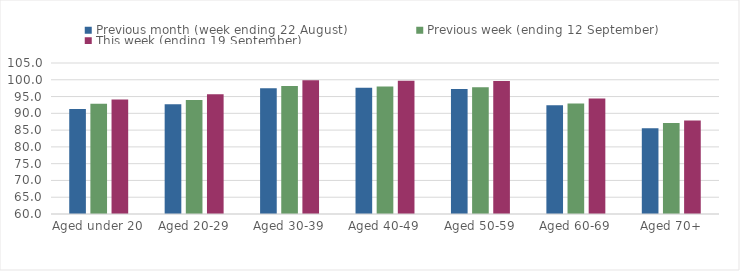
| Category | Previous month (week ending 22 August) | Previous week (ending 12 September) | This week (ending 19 September) |
|---|---|---|---|
| Aged under 20 | 91.26 | 92.89 | 94.09 |
| Aged 20-29 | 92.67 | 93.96 | 95.65 |
| Aged 30-39 | 97.45 | 98.14 | 99.83 |
| Aged 40-49 | 97.6 | 97.96 | 99.71 |
| Aged 50-59 | 97.23 | 97.76 | 99.62 |
| Aged 60-69 | 92.38 | 92.96 | 94.43 |
| Aged 70+ | 85.54 | 87.09 | 87.86 |